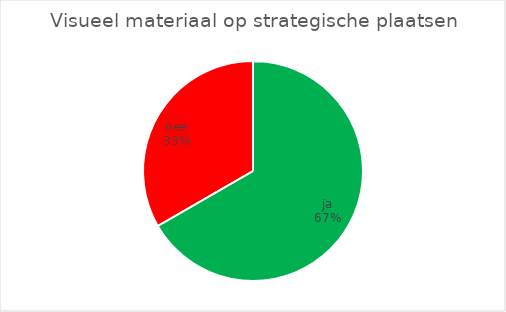
| Category | Visueel materiaal op strategische plaatsen |
|---|---|
| ja | 8 |
| nee | 4 |